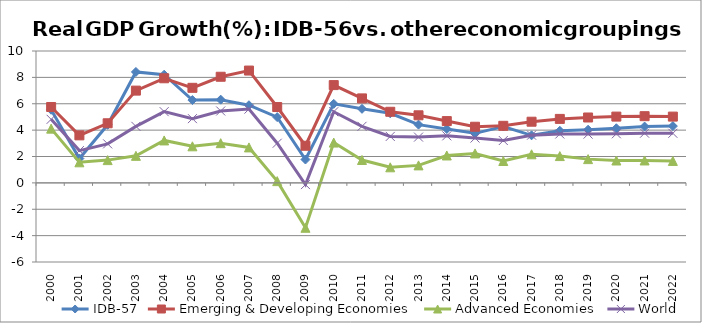
| Category | IDB-57 | Emerging & Developing Economies | Advanced Economies | World |
|---|---|---|---|---|
| 2000.0 | 5.543 | 5.754 | 4.113 | 4.819 |
| 2001.0 | 1.847 | 3.603 | 1.56 | 2.448 |
| 2002.0 | 4.405 | 4.52 | 1.726 | 2.958 |
| 2003.0 | 8.413 | 6.996 | 2.05 | 4.286 |
| 2004.0 | 8.201 | 7.932 | 3.219 | 5.4 |
| 2005.0 | 6.279 | 7.208 | 2.772 | 4.871 |
| 2006.0 | 6.308 | 8.047 | 3.01 | 5.452 |
| 2007.0 | 5.887 | 8.517 | 2.689 | 5.593 |
| 2008.0 | 4.985 | 5.752 | 0.133 | 3.008 |
| 2009.0 | 1.771 | 2.815 | -3.406 | -0.131 |
| 2010.0 | 5.99 | 7.414 | 3.055 | 5.395 |
| 2011.0 | 5.614 | 6.406 | 1.736 | 4.288 |
| 2012.0 | 5.277 | 5.392 | 1.181 | 3.523 |
| 2013.0 | 4.418 | 5.124 | 1.326 | 3.472 |
| 2014.0 | 4.086 | 4.685 | 2.078 | 3.566 |
| 2015.0 | 3.756 | 4.257 | 2.233 | 3.398 |
| 2016.0 | 4.275 | 4.327 | 1.659 | 3.211 |
| 2017.0 | 3.606 | 4.638 | 2.168 | 3.618 |
| 2018.0 | 3.948 | 4.851 | 2.031 | 3.705 |
| 2019.0 | 4.03 | 4.958 | 1.801 | 3.698 |
| 2020.0 | 4.141 | 5.026 | 1.696 | 3.722 |
| 2021.0 | 4.27 | 5.057 | 1.7 | 3.768 |
| 2022.0 | 4.306 | 5.025 | 1.663 | 3.76 |